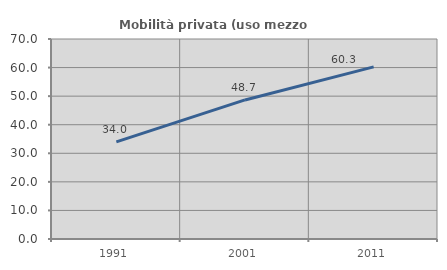
| Category | Mobilità privata (uso mezzo privato) |
|---|---|
| 1991.0 | 33.97 |
| 2001.0 | 48.673 |
| 2011.0 | 60.258 |